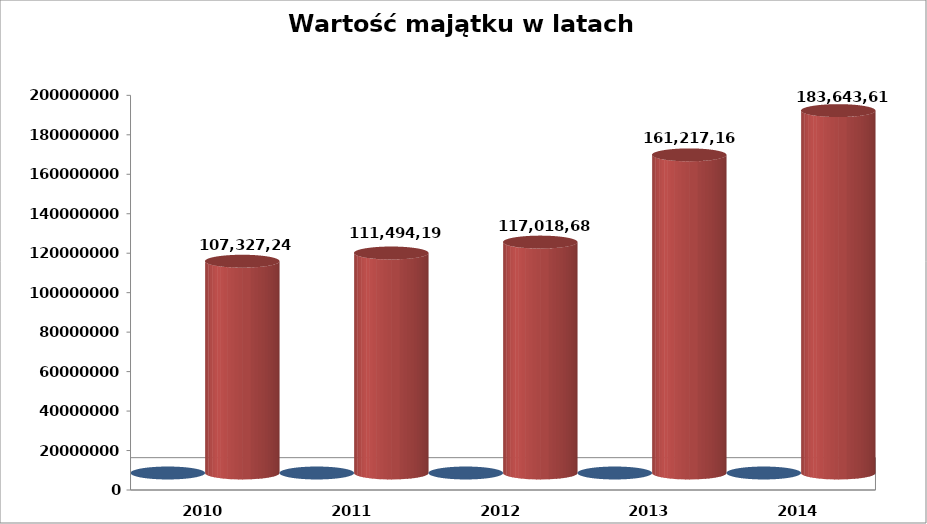
| Category | Rok | Wartość majątku |
|---|---|---|
| 2010.0 | 2010 | 107327241 |
| 2011.0 | 2011 | 111494190 |
| 2012.0 | 2012 | 117018689 |
| 2013.0 | 2013 | 161217165 |
| 2014.0 | 2014 | 183643614.44 |